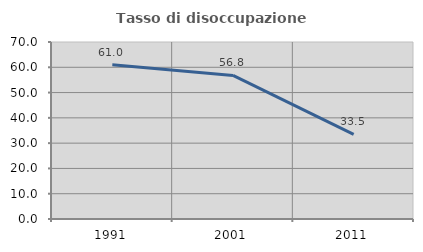
| Category | Tasso di disoccupazione giovanile  |
|---|---|
| 1991.0 | 61.028 |
| 2001.0 | 56.767 |
| 2011.0 | 33.495 |